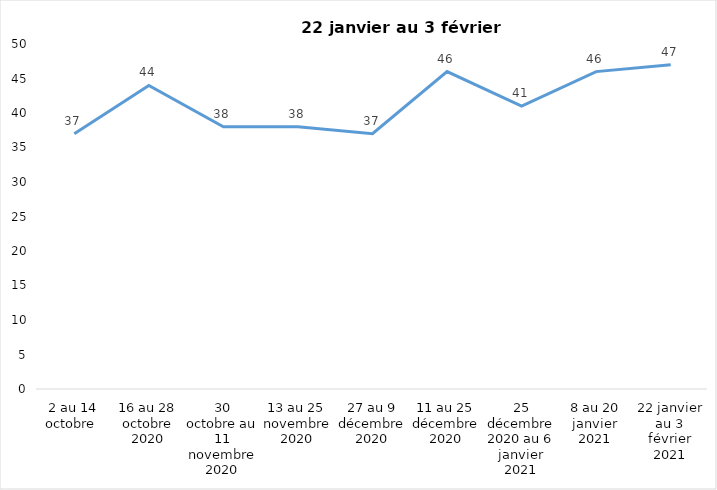
| Category | Toujours aux trois mesures |
|---|---|
| 2 au 14 octobre  | 37 |
| 16 au 28 octobre 2020 | 44 |
| 30 octobre au 11 novembre 2020 | 38 |
| 13 au 25 novembre 2020 | 38 |
| 27 au 9 décembre 2020 | 37 |
| 11 au 25 décembre 2020 | 46 |
| 25 décembre 2020 au 6 janvier 2021 | 41 |
| 8 au 20 janvier 2021 | 46 |
| 22 janvier au 3 février 2021 | 47 |